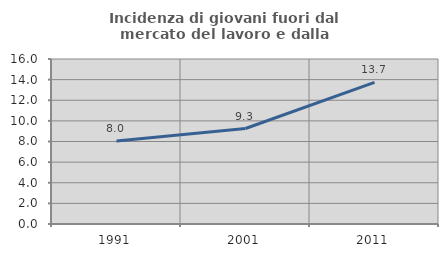
| Category | Incidenza di giovani fuori dal mercato del lavoro e dalla formazione  |
|---|---|
| 1991.0 | 8.046 |
| 2001.0 | 9.259 |
| 2011.0 | 13.725 |